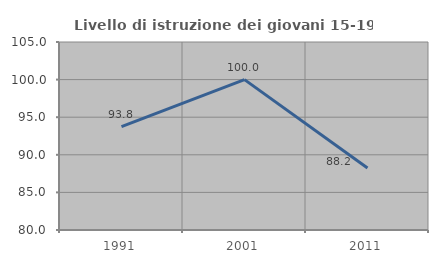
| Category | Livello di istruzione dei giovani 15-19 anni |
|---|---|
| 1991.0 | 93.75 |
| 2001.0 | 100 |
| 2011.0 | 88.235 |